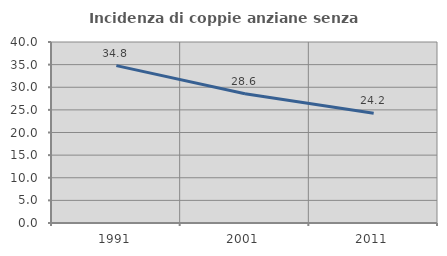
| Category | Incidenza di coppie anziane senza figli  |
|---|---|
| 1991.0 | 34.783 |
| 2001.0 | 28.571 |
| 2011.0 | 24.242 |